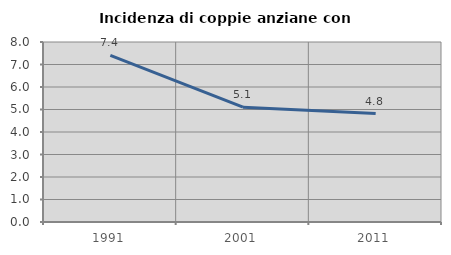
| Category | Incidenza di coppie anziane con figli |
|---|---|
| 1991.0 | 7.407 |
| 2001.0 | 5.102 |
| 2011.0 | 4.819 |